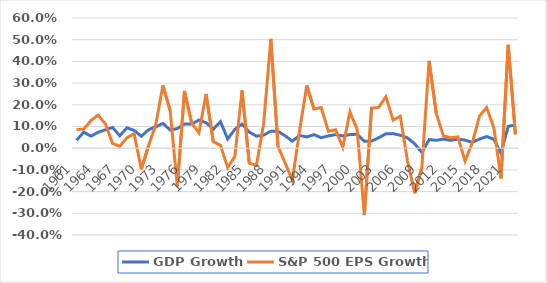
| Category | GDP Growth | S&P 500 EPS Growth |
|---|---|---|
| 1961.0 | 0.037 | 0.086 |
| 1962.0 | 0.074 | 0.088 |
| 1963.0 | 0.056 | 0.128 |
| 1964.0 | 0.074 | 0.152 |
| 1965.0 | 0.084 | 0.112 |
| 1966.0 | 0.096 | 0.022 |
| 1967.0 | 0.057 | 0.008 |
| 1968.0 | 0.094 | 0.048 |
| 1969.0 | 0.082 | 0.067 |
| 1970.0 | 0.055 | -0.097 |
| 1971.0 | 0.085 | 0.012 |
| 1972.0 | 0.098 | 0.108 |
| 1973.0 | 0.114 | 0.289 |
| 1974.0 | 0.084 | 0.175 |
| 1975.0 | 0.09 | -0.175 |
| 1976.0 | 0.112 | 0.264 |
| 1977.0 | 0.111 | 0.115 |
| 1978.0 | 0.13 | 0.071 |
| 1979.0 | 0.117 | 0.25 |
| 1980.0 | 0.088 | 0.03 |
| 1981.0 | 0.122 | 0.013 |
| 1982.0 | 0.043 | -0.09 |
| 1983.0 | 0.087 | -0.038 |
| 1984.0 | 0.111 | 0.267 |
| 1985.0 | 0.075 | -0.069 |
| 1986.0 | 0.055 | -0.079 |
| 1987.0 | 0.06 | 0.111 |
| 1988.0 | 0.079 | 0.504 |
| 1989.0 | 0.077 | 0.008 |
| 1990.0 | 0.057 | -0.069 |
| 1991.0 | 0.033 | -0.148 |
| 1992.0 | 0.059 | 0.081 |
| 1993.0 | 0.052 | 0.289 |
| 1994.0 | 0.063 | 0.18 |
| 1995.0 | 0.048 | 0.187 |
| 1996.0 | 0.057 | 0.078 |
| 1997.0 | 0.062 | 0.085 |
| 1998.0 | 0.057 | 0.004 |
| 1999.0 | 0.063 | 0.167 |
| 2000.0 | 0.064 | 0.086 |
| 2001.0 | 0.032 | -0.308 |
| 2002.0 | 0.033 | 0.185 |
| 2003.0 | 0.048 | 0.188 |
| 2004.0 | 0.066 | 0.238 |
| 2005.0 | 0.067 | 0.13 |
| 2006.0 | 0.06 | 0.147 |
| 2007.0 | 0.048 | -0.059 |
| 2008.0 | 0.02 | -0.208 |
| 2009.0 | -0.02 | -0.088 |
| 2010.0 | 0.039 | 0.403 |
| 2011.0 | 0.037 | 0.16 |
| 2012.0 | 0.042 | 0.056 |
| 2013.0 | 0.036 | 0.049 |
| 2014.0 | 0.042 | 0.052 |
| 2015.0 | 0.037 | -0.059 |
| 2016.0 | 0.027 | 0.024 |
| 2017.0 | 0.042 | 0.148 |
| 2018.0 | 0.054 | 0.187 |
| 2019.0 | 0.041 | 0.094 |
| 2020.0 | -0.022 | -0.139 |
| 2021.0 | 0.101 | 0.477 |
| 2022.0 | 0.107 | 0.064 |